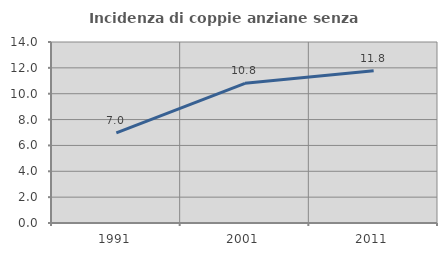
| Category | Incidenza di coppie anziane senza figli  |
|---|---|
| 1991.0 | 6.969 |
| 2001.0 | 10.802 |
| 2011.0 | 11.767 |